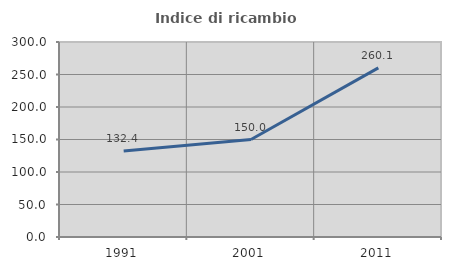
| Category | Indice di ricambio occupazionale  |
|---|---|
| 1991.0 | 132.422 |
| 2001.0 | 150 |
| 2011.0 | 260.123 |